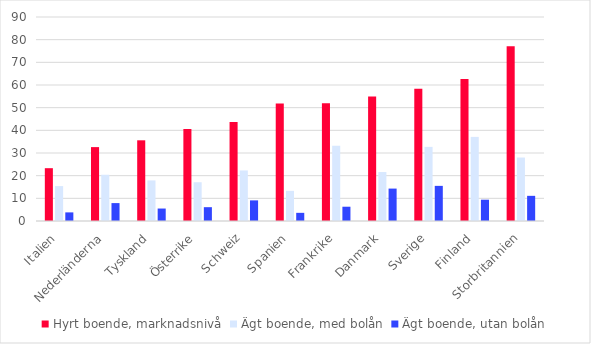
| Category | Hyrt boende, marknadsnivå | Ägt boende, med bolån | Ägt boende, utan bolån |
|---|---|---|---|
| Italien | 23.3 | 15.4 | 3.8 |
| Nederländerna | 32.6 | 20.4 | 7.9 |
| Tyskland | 35.6 | 17.9 | 5.5 |
| Österrike | 40.6 | 17.1 | 6.1 |
| Schweiz | 43.7 | 22.3 | 9.1 |
| Spanien | 51.8 | 13.3 | 3.6 |
| Frankrike | 51.9 | 33.2 | 6.3 |
| Danmark | 54.9 | 21.6 | 14.3 |
| Sverige | 58.4 | 32.7 | 15.5 |
| Finland | 62.7 | 37.1 | 9.4 |
| Storbritannien | 77.1 | 28 | 11.1 |